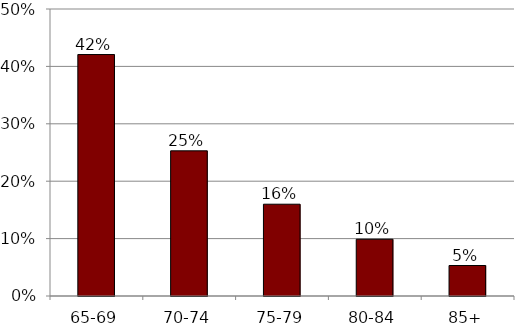
| Category | Series 0 |
|---|---|
| 65-69 | 0.421 |
| 70-74 | 0.253 |
| 75-79 | 0.16 |
| 80-84 | 0.099 |
| 85+ | 0.053 |